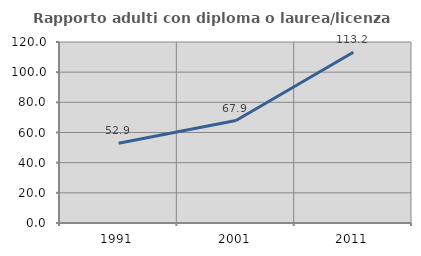
| Category | Rapporto adulti con diploma o laurea/licenza media  |
|---|---|
| 1991.0 | 52.915 |
| 2001.0 | 67.918 |
| 2011.0 | 113.19 |